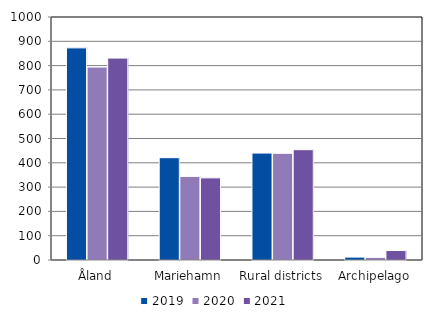
| Category | 2019 | 2020 | 2021 |
|---|---|---|---|
| Åland | 873 | 794 | 831 |
| Mariehamn | 421 | 344 | 338 |
| Rural districts | 440 | 439 | 454 |
| Archipelago | 12 | 11 | 39 |